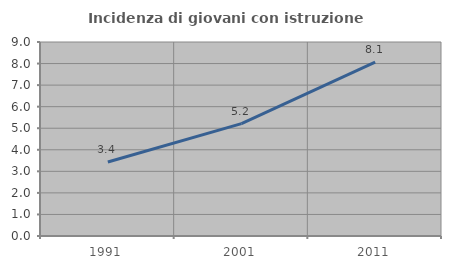
| Category | Incidenza di giovani con istruzione universitaria |
|---|---|
| 1991.0 | 3.43 |
| 2001.0 | 5.215 |
| 2011.0 | 8.065 |